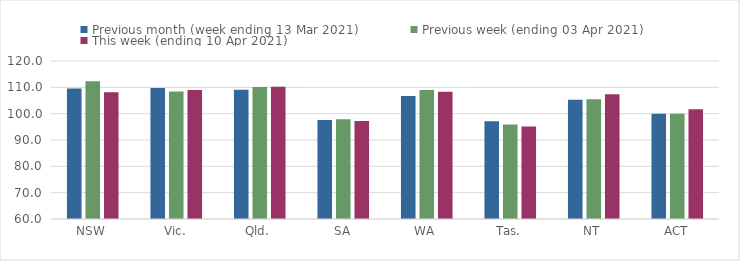
| Category | Previous month (week ending 13 Mar 2021) | Previous week (ending 03 Apr 2021) | This week (ending 10 Apr 2021) |
|---|---|---|---|
| NSW | 109.59 | 112.35 | 108.14 |
| Vic. | 109.75 | 108.39 | 109.03 |
| Qld. | 109.05 | 110.17 | 110.19 |
| SA | 97.63 | 97.84 | 97.22 |
| WA | 106.72 | 109.03 | 108.31 |
| Tas. | 97.16 | 95.86 | 95.13 |
| NT | 105.25 | 105.5 | 107.37 |
| ACT | 99.97 | 100 | 101.64 |